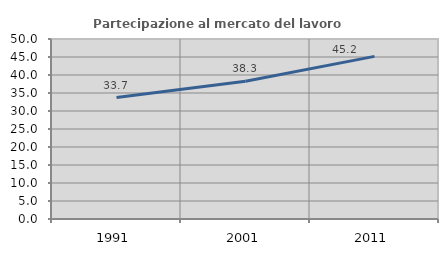
| Category | Partecipazione al mercato del lavoro  femminile |
|---|---|
| 1991.0 | 33.742 |
| 2001.0 | 38.266 |
| 2011.0 | 45.171 |